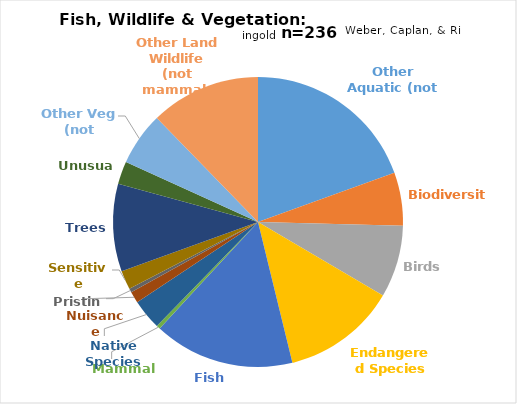
| Category | TOTALS: |
|---|---|
| Other Aquatic (not fish) | 46 |
| Biodiversity | 14 |
| Birds | 19 |
| Endangered Species | 30 |
| Fish | 37 |
| Mammals | 1 |
| Native Species | 8 |
| Nuisance Species | 3 |
| Pristine | 1 |
| Sensitive Species | 5 |
| Trees | 23 |
| Unusual | 6 |
| Other Veg (not trees) | 14 |
| Other Land Wildlife (not mammals or birds) | 29 |